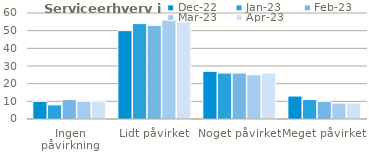
| Category | dec-22 | jan-23 | feb-23 | mar-23 | apr-23 |
|---|---|---|---|---|---|
| Ingen påvirkning | 10 | 8 | 11 | 10 | 10 |
| Lidt påvirket | 50 | 54 | 53 | 56 | 55 |
| Noget påvirket | 27 | 26 | 26 | 25 | 26 |
| Meget påvirket | 13 | 11 | 10 | 9 | 9 |